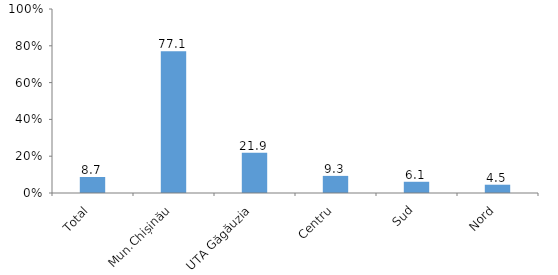
| Category | Series 0 |
|---|---|
| Total | 8.7 |
| Mun.Chișinău | 77.1 |
| UTA Găgăuzia | 21.9 |
| Centru | 9.3 |
| Sud | 6.1 |
| Nord | 4.5 |